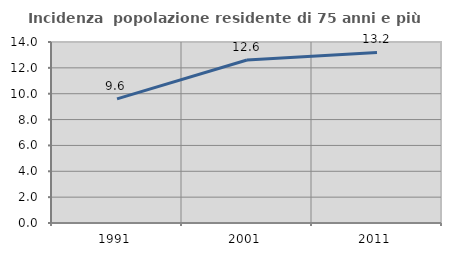
| Category | Incidenza  popolazione residente di 75 anni e più |
|---|---|
| 1991.0 | 9.601 |
| 2001.0 | 12.61 |
| 2011.0 | 13.196 |